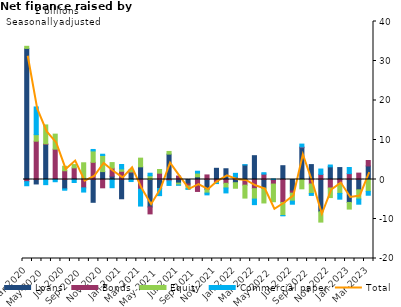
| Category | Loans | Bonds | Equity | Commercial paper |
|---|---|---|---|---|
| Mar-2020 | 33.188 | -0.54 | 0.533 | -1.041 |
| Apr-2020 | -1.127 | 9.698 | 1.656 | 7.014 |
| May-2020 | 8.903 | 0.131 | 4.787 | -1.303 |
| Jun-2020 | 0.186 | 7.494 | 3.806 | -0.564 |
| Jul-2020 | -2.375 | 2.212 | 1.141 | -0.34 |
| Aug-2020 | 0.337 | 2.614 | 0.831 | -0.762 |
| Sep-2020 | 0.345 | -2.122 | 3.887 | -1.058 |
| Oct-2020 | -5.773 | 4.349 | 2.888 | 0.366 |
| Nov-2020 | 1.998 | -2.106 | 4.075 | 0.327 |
| Dec-2020 | 0.858 | 2.015 | 1.408 | -2.076 |
| Jan-2021 | -4.876 | 2.081 | 0.601 | 1.11 |
| Feb-2021 | 1.736 | 0.193 | 0.584 | -0.517 |
| Mar-2021 | 3.206 | -2.452 | 2.201 | -4.272 |
| Apr-2021 | -6.953 | -1.754 | 0.938 | 0.65 |
| May-2021 | -2.271 | 1.596 | 0.936 | -1.817 |
| Jun-2021 | 6.425 | -0.338 | 0.679 | -1.166 |
| Jul-2021 | -0.91 | 0.867 | -0.474 | -0.072 |
| Aug-2021 | -1.138 | -0.499 | -0.713 | -0.136 |
| Sep-2021 | 0.68 | -3.026 | 0.939 | 0.481 |
| Oct-2021 | -2.546 | 1.158 | -0.899 | -0.446 |
| Nov-2021 | 2.836 | -0.729 | -0.195 | -0.107 |
| Dec-2021 | 2.72 | -0.957 | -1.187 | -1.25 |
| Jan-2022 | -0.809 | 0.598 | -1.403 | 0.961 |
| Feb-2022 | 3.682 | -1.431 | -3.274 | 0.058 |
| Mar-2022 | 6.03 | -2.323 | -2.636 | -1.403 |
| Apr-2022 | -2.199 | 1.362 | -3.74 | 0.359 |
| May-2022 | -0.214 | -0.942 | -4.471 | 0.142 |
| Jun-2022 | 3.493 | -5.816 | -3.301 | -0.081 |
| Jul-2022 | -2.9 | -0.555 | -2.014 | -0.789 |
| Aug-2022 | 8.051 | 0.173 | -2.361 | 0.742 |
| Sep-2022 | 3.775 | -1.135 | -2.399 | -0.495 |
| Oct-2022 | -8.166 | 1.304 | -2.618 | 1.347 |
| Nov-2022 | 3.205 | -2.15 | -2.427 | 0.46 |
| Dec-2022 | 3.021 | -1.032 | -2.489 | -1.457 |
| Jan-2023 | -5.807 | 1.488 | -1.685 | 1.544 |
| Feb-2023 | -2.614 | 1.616 | -2.334 | -1.306 |
| Mar-2023 | 3.43 | 1.375 | -3.009 | -0.973 |